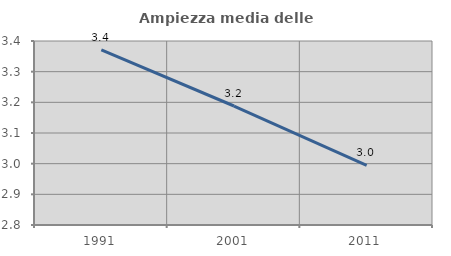
| Category | Ampiezza media delle famiglie |
|---|---|
| 1991.0 | 3.371 |
| 2001.0 | 3.188 |
| 2011.0 | 2.995 |